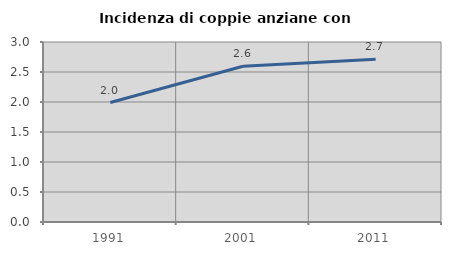
| Category | Incidenza di coppie anziane con figli |
|---|---|
| 1991.0 | 1.991 |
| 2001.0 | 2.596 |
| 2011.0 | 2.713 |